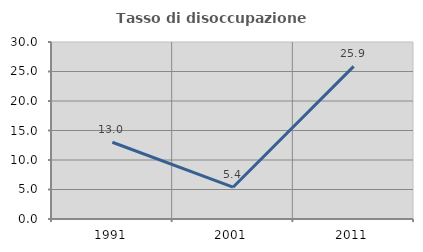
| Category | Tasso di disoccupazione giovanile  |
|---|---|
| 1991.0 | 13.008 |
| 2001.0 | 5.389 |
| 2011.0 | 25.874 |